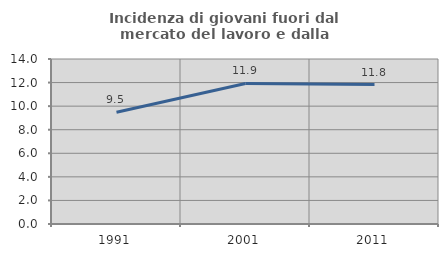
| Category | Incidenza di giovani fuori dal mercato del lavoro e dalla formazione  |
|---|---|
| 1991.0 | 9.476 |
| 2001.0 | 11.923 |
| 2011.0 | 11.834 |